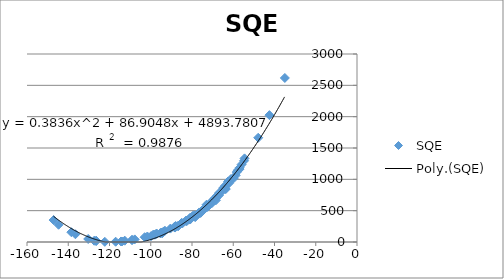
| Category | SQE |
|---|---|
| -114.3898457949081 | 8.469 |
| -113.9901565629184 | 7.895 |
| -112.6183645182415 | 20.991 |
| -109.0591950168699 | 31.819 |
| -99.85370122630775 | 93.051 |
| -98.78116306013347 | 117.047 |
| -138.508231400452 | 156.456 |
| -136.5267886393551 | 123.805 |
| -130.3243680429 | 47.947 |
| -127.4116039666158 | 20.355 |
| -126.4904981766517 | 15.924 |
| -126.4466959072269 | 19.773 |
| -122.2684273898568 | 2.784 |
| -117.0116374081 | 4.361 |
| -109.1059561737143 | 32.422 |
| -102.9521350162356 | 76.525 |
| -107.7703357891235 | 41.341 |
| -97.10074740765138 | 134.543 |
| -144.6965862342691 | 275.447 |
| -98.0 | 116.64 |
| -97.4432422682383 | 126.715 |
| -95.4 | 139.24 |
| -95.2 | 144 |
| -94.59351287117691 | 151.45 |
| -94.50666687882902 | 143.84 |
| -94.44668347411456 | 140.501 |
| -93.11031654750529 | 179.284 |
| -87.91855811321149 | 255.406 |
| -82.93969245911583 | 337.101 |
| -82.56040440476832 | 332.683 |
| -81.0591553784514 | 358.756 |
| -80.9 | 388.09 |
| -78.53318898413762 | 401.875 |
| -75.3 | 495.508 |
| -90.47155719256581 | 213.991 |
| -85.04377358142933 | 304.72 |
| -84.61623960251423 | 298.728 |
| -82.81879512698484 | 341.555 |
| -79.52930543300386 | 413.337 |
| -76.8398023865698 | 451.996 |
| -76.48284110277493 | 471.635 |
| -75.53087797673115 | 484.401 |
| -74.2886269932406 | 522.185 |
| -73.52135826693547 | 547.965 |
| -71.60713771742058 | 608.257 |
| -69.51214573583958 | 656.274 |
| -68.6471525251989 | 696.055 |
| -67.9305627408738 | 729.51 |
| -67.63815194835354 | 741.574 |
| -66.90272555631658 | 781.609 |
| -65.24666669830864 | 817.007 |
| -64.84153355977745 | 861.92 |
| -63.9371056960885 | 849.308 |
| -63.87806800786674 | 898.916 |
| -63.62147779269233 | 844.979 |
| -61.16696684364729 | 1003.181 |
| -59.77678626645714 | 1017.815 |
| -58.79484040982287 | 1065.054 |
| -58.31183635902705 | 1115.437 |
| -56.95142239378801 | 1163.395 |
| -56.88382430058307 | 1184.473 |
| -55.9536439666339 | 1236.673 |
| -54.7696095765014 | 1296.028 |
| -47.88416335745977 | 1663.484 |
| -34.9873068928761 | 2617.621 |
| -147.114252427446 | 350.223 |
| -93.72873288014739 | 168.254 |
| -80.59985699859894 | 369.03 |
| -79.67002708321459 | 412.901 |
| -75.58776120403206 | 477.083 |
| -75.08689239612619 | 498.321 |
| -72.95324748231813 | 595.202 |
| -71.95844907704503 | 576.555 |
| -70.52862200765571 | 615.604 |
| -69.98183713561 | 638.986 |
| -69.8601092220135 | 665.118 |
| -69.33630048856504 | 684.016 |
| -68.68349062745457 | 698.889 |
| -68.56515843572629 | 705.691 |
| -68.46923263311398 | 702.291 |
| -68.40379060079098 | 665.96 |
| -66.96299262656632 | 744.035 |
| -64.61147974887228 | 851.386 |
| -64.26283259375933 | 873.626 |
| -62.52679257655996 | 965.544 |
| -62.25453740197651 | 953.294 |
| -62.035511045921 | 938.472 |
| -57.78512055355507 | 1145.476 |
| -54.52065892471743 | 1334.393 |
| -42.45693179407174 | 2024.376 |
| -101.6370439625229 | 87.665 |
| -88.57995606116052 | 237.778 |
| -88.45507990043382 | 241.645 |
| -88.2152996256165 | 230.575 |
| -86.83472154148726 | 254.89 |
| -86.6605875159452 | 254.065 |
| -81.59332753013527 | 357.462 |
| -78.84235366023378 | 425.087 |
| -78.39189517140665 | 399.924 |
| -75.82476526294278 | 463.766 |
| -72.75720608009966 | 554.734 |